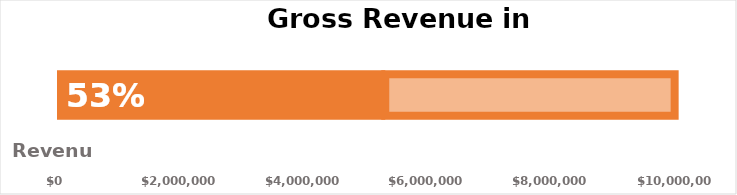
| Category | Revenue | Remainder |
|---|---|---|
| Europe | 5250000 | 4750000 |